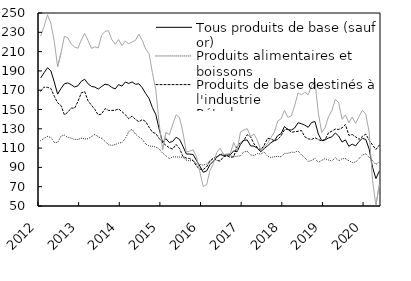
| Category | Tous produits de base (sauf or) | Produits alimentaires et boissons | Produits de base destinés à l'industrie | Pétrole |
|---|---|---|---|---|
| 2012.0 | 182.704 | 117.697 | 168.93 | 225.891 |
| 40940.0 | 188.053 | 120.094 | 173.19 | 236.121 |
| 40969.0 | 193.248 | 122.112 | 172.913 | 248.161 |
| 41000.0 | 190.118 | 121.01 | 171.854 | 239.281 |
| 41030.0 | 178.59 | 115.853 | 163.82 | 220.831 |
| 41061.0 | 165.947 | 115.707 | 156.91 | 194.356 |
| 41091.0 | 171.798 | 122.365 | 154.089 | 208.467 |
| 41122.0 | 176.694 | 123.489 | 144.494 | 225.861 |
| 41153.0 | 177.55 | 121.243 | 147.149 | 224.393 |
| 41183.0 | 175.734 | 120.248 | 151.496 | 217.89 |
| 41214.0 | 173.357 | 118.999 | 151.291 | 214.737 |
| 41244.0 | 174.529 | 118.937 | 158.317 | 213.424 |
| 2013.0 | 179.315 | 120.259 | 167.262 | 222.008 |
| 41306.0 | 181.359 | 119.479 | 168.512 | 228.805 |
| 41334.0 | 176.563 | 119.709 | 158.758 | 221.554 |
| 41365.0 | 173.905 | 121.885 | 154.441 | 213.313 |
| 41395.0 | 173.269 | 124.173 | 150.035 | 215.012 |
| 41426.0 | 171.169 | 121.837 | 144.348 | 213.779 |
| 41456.0 | 173.862 | 120.159 | 145.452 | 226.912 |
| 41487.0 | 176.258 | 117.119 | 150.925 | 230.852 |
| 41518.0 | 175.54 | 113.543 | 149.044 | 231.745 |
| 41548.0 | 172.863 | 112.804 | 149.074 | 222.316 |
| 41579.0 | 171.323 | 113.624 | 149.215 | 217.609 |
| 41609.0 | 175.774 | 115.189 | 150.677 | 222.568 |
| 2014.0 | 174.265 | 115.747 | 147.819 | 216.112 |
| 41671.0 | 178.546 | 119.764 | 144.708 | 220.88 |
| 41699.0 | 176.935 | 127.13 | 140.427 | 218.154 |
| 41730.0 | 178.571 | 129.574 | 143.177 | 219.945 |
| 41760.0 | 176.184 | 124.464 | 139.708 | 221.712 |
| 41791.0 | 176.61 | 121.591 | 137.345 | 228.155 |
| 41821.0 | 172.544 | 119.182 | 139.59 | 221.556 |
| 41852.0 | 166.509 | 114.278 | 137.52 | 212.788 |
| 41883.0 | 161.373 | 112.203 | 131.649 | 207.607 |
| 41913.0 | 151.914 | 111.897 | 126.427 | 188.066 |
| 41944.0 | 144.728 | 111.204 | 125.038 | 170.229 |
| 41974.0 | 129.62 | 109.182 | 119.964 | 134.86 |
| 2015.0 | 115.802 | 104.764 | 115.766 | 108.343 |
| 42036.0 | 119.77 | 101.967 | 112.895 | 126.228 |
| 42064.0 | 115.739 | 99.109 | 110.26 | 123.821 |
| 42095.0 | 116.979 | 100.93 | 109.024 | 134.673 |
| 42125.0 | 121.255 | 100.83 | 113.79 | 144.433 |
| 42156.0 | 118.975 | 100.704 | 109.543 | 141.632 |
| 42186.0 | 111.918 | 100.545 | 101.336 | 126.587 |
| 42217.0 | 103.991 | 97.611 | 99.683 | 105.847 |
| 42248.0 | 103.752 | 96.656 | 99.125 | 106.8 |
| 42278.0 | 103.387 | 97.253 | 97.182 | 108.349 |
| 42309.0 | 97.273 | 93.465 | 91.345 | 101.211 |
| 42339.0 | 91.34 | 92.995 | 88.243 | 85.533 |
| 2016.0 | 85.03 | 92.448 | 87.712 | 70.151 |
| 42401.0 | 86.381 | 93.565 | 90.702 | 72.264 |
| 42430.0 | 92.904 | 96.979 | 96.516 | 86.755 |
| 42461.0 | 96.447 | 99.745 | 99.375 | 93.788 |
| 42491.0 | 100.548 | 101.157 | 97.25 | 105.65 |
| 42522.0 | 103.318 | 103.398 | 96.635 | 109.862 |
| 42552.0 | 102.342 | 103.867 | 101.092 | 103.171 |
| 42583.0 | 102.839 | 102.184 | 102.013 | 103.943 |
| 42614.0 | 103.032 | 101.994 | 100.398 | 104.458 |
| 42644.0 | 107.148 | 101.066 | 101.007 | 115.851 |
| 42675.0 | 106.174 | 101.55 | 111.672 | 107.406 |
| 42705.0 | 113.838 | 102.048 | 115.628 | 126.701 |
| 2017.0 | 118.217 | 106.217 | 118.061 | 128.753 |
| 42767.0 | 118.348 | 106.52 | 123.831 | 130.134 |
| 42795.0 | 112.254 | 103.07 | 121.685 | 121.938 |
| 42826.0 | 112.061 | 102.277 | 114.313 | 124.52 |
| 42856.0 | 109.868 | 104.346 | 110.609 | 117.836 |
| 42887.0 | 106.175 | 103.717 | 107.98 | 108.209 |
| 42917.0 | 109.552 | 106.036 | 113.036 | 110.834 |
| 42948.0 | 112.351 | 101.615 | 120.119 | 114.853 |
| 42979.0 | 115.612 | 100.278 | 119.493 | 120.9 |
| 43009.0 | 117.624 | 101.026 | 117.539 | 126.426 |
| 43040.0 | 122.9 | 101.414 | 118.953 | 138.154 |
| 43070.0 | 125.015 | 101.076 | 122.815 | 140.336 |
| 2018.0 | 132.461 | 104.434 | 128.977 | 149.218 |
| 43132.0 | 129.103 | 104.658 | 129.864 | 141.805 |
| 43160.0 | 128.656 | 105.77 | 126.245 | 143.344 |
| 43191.0 | 130.792 | 105.636 | 127.009 | 153.865 |
| 43221.0 | 136.294 | 107.162 | 127.444 | 167.078 |
| 43252.0 | 135.283 | 102.908 | 128.27 | 165.24 |
| 43282.0 | 133.789 | 100.185 | 121.706 | 167.918 |
| 43313.0 | 131.569 | 96.184 | 119.661 | 165.282 |
| 43344.0 | 136.546 | 97.254 | 118.914 | 174.66 |
| 43374.0 | 137.506 | 99.308 | 120.706 | 179.056 |
| 43405.0 | 124.573 | 95.102 | 118.809 | 146.292 |
| 43435.0 | 117.772 | 97.404 | 117.535 | 126.077 |
| 2019.0 | 118.617 | 99.119 | 118.837 | 131.423 |
| 43497.0 | 120.512 | 97.622 | 125.809 | 142.528 |
| 43525.0 | 121.686 | 96.785 | 127.539 | 148.86 |
| 43556.0 | 125.721 | 100 | 129.657 | 160.454 |
| 43586.0 | 122.471 | 96.778 | 129.331 | 157.124 |
| 43617.0 | 116.283 | 98.98 | 130.989 | 139.917 |
| 43647.0 | 118.509 | 99.062 | 134.434 | 144.447 |
| 43678.0 | 111.881 | 96.929 | 123.198 | 136.171 |
| 43709.0 | 114.101 | 95.077 | 124.102 | 142.326 |
| 43739.0 | 112.261 | 95.459 | 121.736 | 135.546 |
| 43770.0 | 116.812 | 99.169 | 119.01 | 142.596 |
| 43800.0 | 120.102 | 102.777 | 122.086 | 149.215 |
| 2020.0 | 118.936 | 104.104 | 124.488 | 145.136 |
| 43862.0 | 109.106 | 100.386 | 118.313 | 126.529 |
| 43891.0 | 90.064 | 96.912 | 113.213 | 76.22 |
| 43922.0 | 78.444 | 93.015 | 108.553 | 50.446 |
| 43952.0 | 86.134 | 95.552 | 113.082 | 72.3 |